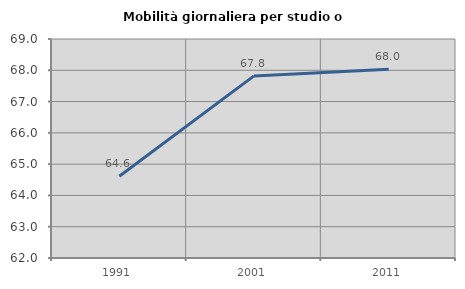
| Category | Mobilità giornaliera per studio o lavoro |
|---|---|
| 1991.0 | 64.612 |
| 2001.0 | 67.82 |
| 2011.0 | 68.033 |